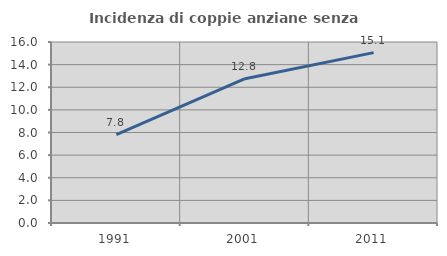
| Category | Incidenza di coppie anziane senza figli  |
|---|---|
| 1991.0 | 7.812 |
| 2001.0 | 12.752 |
| 2011.0 | 15.06 |